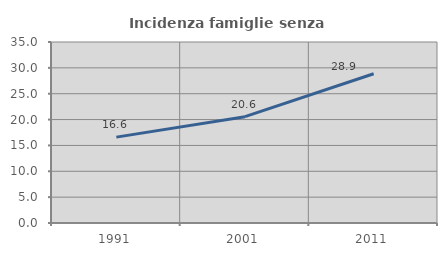
| Category | Incidenza famiglie senza nuclei |
|---|---|
| 1991.0 | 16.608 |
| 2001.0 | 20.558 |
| 2011.0 | 28.864 |